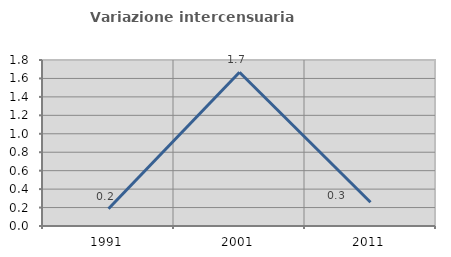
| Category | Variazione intercensuaria annua |
|---|---|
| 1991.0 | 0.186 |
| 2001.0 | 1.668 |
| 2011.0 | 0.258 |